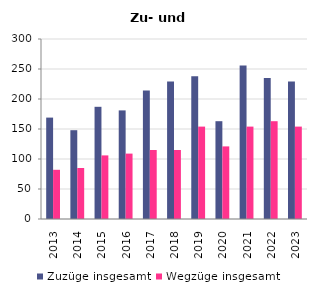
| Category | Zuzüge insgesamt | Wegzüge insgesamt |
|---|---|---|
| 2013.0 | 169 | 82 |
| 2014.0 | 148 | 85 |
| 2015.0 | 187 | 106 |
| 2016.0 | 181 | 109 |
| 2017.0 | 214 | 115 |
| 2018.0 | 229 | 115 |
| 2019.0 | 238 | 154 |
| 2020.0 | 163 | 121 |
| 2021.0 | 256 | 154 |
| 2022.0 | 235 | 163 |
| 2023.0 | 229 | 154 |